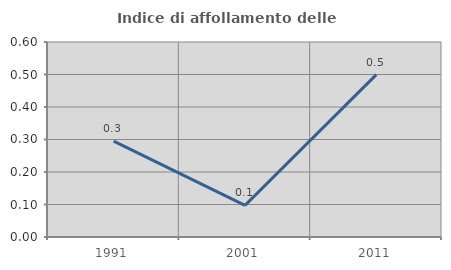
| Category | Indice di affollamento delle abitazioni  |
|---|---|
| 1991.0 | 0.295 |
| 2001.0 | 0.097 |
| 2011.0 | 0.5 |